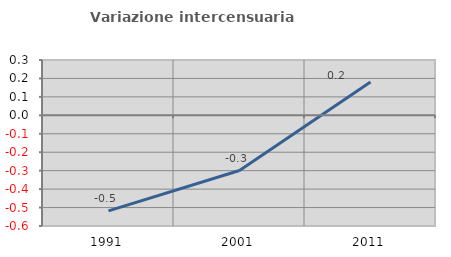
| Category | Variazione intercensuaria annua |
|---|---|
| 1991.0 | -0.518 |
| 2001.0 | -0.299 |
| 2011.0 | 0.181 |